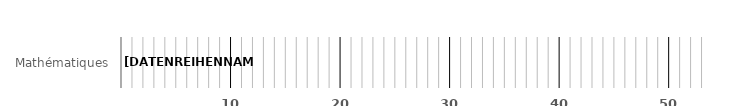
| Category | non recommandé |
|---|---|
| Mathématiques | 0 |